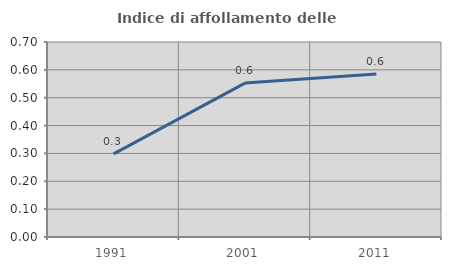
| Category | Indice di affollamento delle abitazioni  |
|---|---|
| 1991.0 | 0.299 |
| 2001.0 | 0.552 |
| 2011.0 | 0.585 |